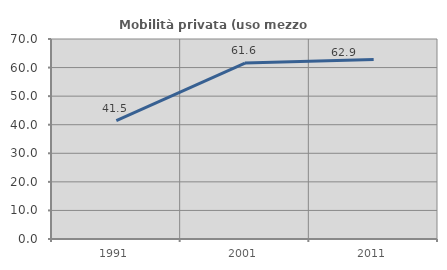
| Category | Mobilità privata (uso mezzo privato) |
|---|---|
| 1991.0 | 41.452 |
| 2001.0 | 61.559 |
| 2011.0 | 62.865 |